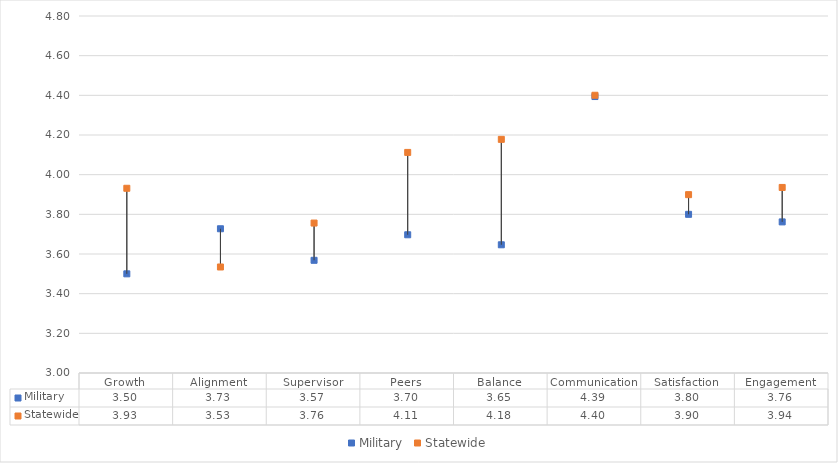
| Category | Military | Statewide |
|---|---|---|
| Growth | 3.5 | 3.931 |
| Alignment | 3.727 | 3.534 |
| Supervisor | 3.568 | 3.756 |
| Peers | 3.697 | 4.112 |
| Balance | 3.646 | 4.178 |
| Communication | 4.394 | 4.4 |
| Satisfaction | 3.8 | 3.899 |
| Engagement | 3.762 | 3.936 |